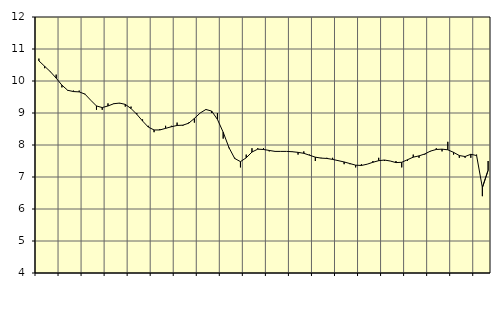
| Category | Piggar | Tillverkning av verkstadsvaror, SNI 25-30, 33 |
|---|---|---|
| nan | 10.7 | 10.63 |
| 1.0 | 10.4 | 10.46 |
| 1.0 | 10.3 | 10.29 |
| 1.0 | 10.2 | 10.09 |
| nan | 9.8 | 9.87 |
| 2.0 | 9.7 | 9.71 |
| 2.0 | 9.7 | 9.67 |
| 2.0 | 9.7 | 9.66 |
| nan | 9.6 | 9.59 |
| 3.0 | 9.4 | 9.4 |
| 3.0 | 9.1 | 9.22 |
| 3.0 | 9.1 | 9.17 |
| nan | 9.3 | 9.22 |
| 4.0 | 9.3 | 9.29 |
| 4.0 | 9.3 | 9.31 |
| 4.0 | 9.2 | 9.27 |
| nan | 9.2 | 9.14 |
| 5.0 | 9 | 8.96 |
| 5.0 | 8.8 | 8.75 |
| 5.0 | 8.6 | 8.56 |
| nan | 8.4 | 8.47 |
| 6.0 | 8.5 | 8.47 |
| 6.0 | 8.6 | 8.52 |
| 6.0 | 8.6 | 8.57 |
| nan | 8.7 | 8.61 |
| 7.0 | 8.6 | 8.62 |
| 7.0 | 8.7 | 8.68 |
| 7.0 | 8.7 | 8.83 |
| nan | 9 | 9 |
| 8.0 | 9.1 | 9.11 |
| 8.0 | 9 | 9.06 |
| 8.0 | 9 | 8.8 |
| nan | 8.2 | 8.4 |
| 9.0 | 7.9 | 7.92 |
| 9.0 | 7.6 | 7.58 |
| 9.0 | 7.3 | 7.48 |
| nan | 7.7 | 7.6 |
| 10.0 | 7.9 | 7.78 |
| 10.0 | 7.9 | 7.87 |
| 10.0 | 7.9 | 7.86 |
| nan | 7.8 | 7.83 |
| 11.0 | 7.8 | 7.8 |
| 11.0 | 7.8 | 7.8 |
| 11.0 | 7.8 | 7.8 |
| nan | 7.8 | 7.79 |
| 12.0 | 7.7 | 7.77 |
| 12.0 | 7.8 | 7.74 |
| 12.0 | 7.7 | 7.68 |
| nan | 7.5 | 7.62 |
| 13.0 | 7.6 | 7.59 |
| 13.0 | 7.6 | 7.58 |
| 13.0 | 7.6 | 7.55 |
| nan | 7.5 | 7.51 |
| 14.0 | 7.4 | 7.47 |
| 14.0 | 7.4 | 7.42 |
| 14.0 | 7.3 | 7.37 |
| nan | 7.4 | 7.36 |
| 15.0 | 7.4 | 7.4 |
| 15.0 | 7.5 | 7.46 |
| 15.0 | 7.6 | 7.51 |
| nan | 7.5 | 7.53 |
| 16.0 | 7.5 | 7.5 |
| 16.0 | 7.5 | 7.45 |
| 16.0 | 7.3 | 7.46 |
| nan | 7.5 | 7.54 |
| 17.0 | 7.7 | 7.62 |
| 17.0 | 7.6 | 7.66 |
| 17.0 | 7.7 | 7.72 |
| nan | 7.8 | 7.81 |
| 18.0 | 7.9 | 7.86 |
| 18.0 | 7.8 | 7.87 |
| 18.0 | 8.1 | 7.85 |
| nan | 7.7 | 7.77 |
| 19.0 | 7.6 | 7.67 |
| 19.0 | 7.6 | 7.64 |
| 19.0 | 7.6 | 7.71 |
| nan | 7.7 | 7.67 |
| 20.0 | 6.4 | 6.67 |
| 20.0 | 7.5 | 7.21 |